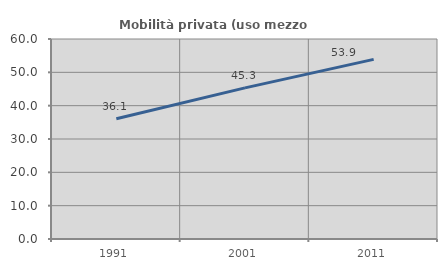
| Category | Mobilità privata (uso mezzo privato) |
|---|---|
| 1991.0 | 36.065 |
| 2001.0 | 45.343 |
| 2011.0 | 53.887 |